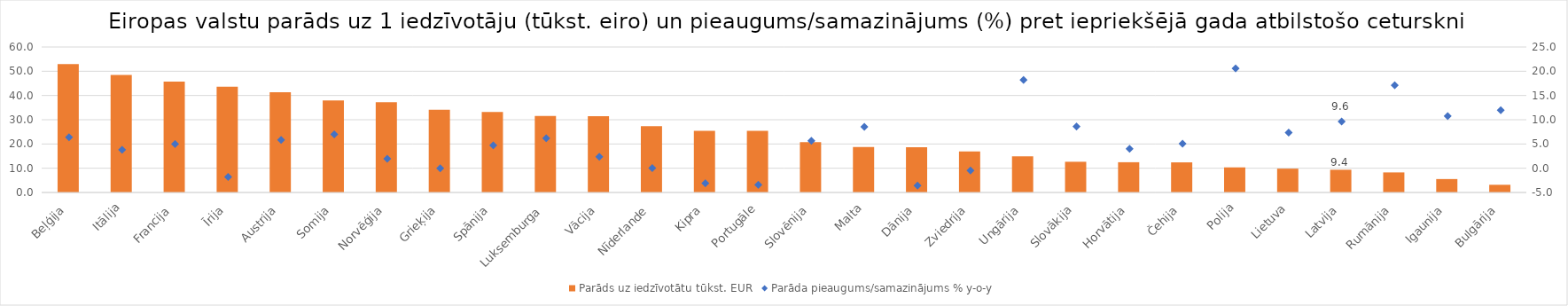
| Category | Parāds uz iedzīvotātu tūkst. EUR |
|---|---|
|  Beļģija | 52.931 |
| Itālija | 48.508 |
| Francija | 45.696 |
| Īrija | 43.611 |
| Austrija | 41.335 |
| Somija | 37.944 |
| Norvēģija | 37.243 |
| Grieķija | 34.102 |
| Spānija | 33.179 |
| Luksemburga | 31.544 |
| Vācija | 31.508 |
| Nīderlande | 27.325 |
| Kipra | 25.463 |
| Portugāle | 25.414 |
| Slovēnija | 20.725 |
| Malta | 18.749 |
| Dānija | 18.646 |
| Zviedrija | 16.951 |
| Ungārija | 14.865 |
| Slovākija | 12.665 |
| Horvātija | 12.477 |
| Čehija | 12.416 |
| Polija | 10.35 |
| Lietuva | 9.821 |
| Latvija | 9.373 |
| Rumānija | 8.27 |
| Igaunija | 5.537 |
| Bulgārija | 3.169 |